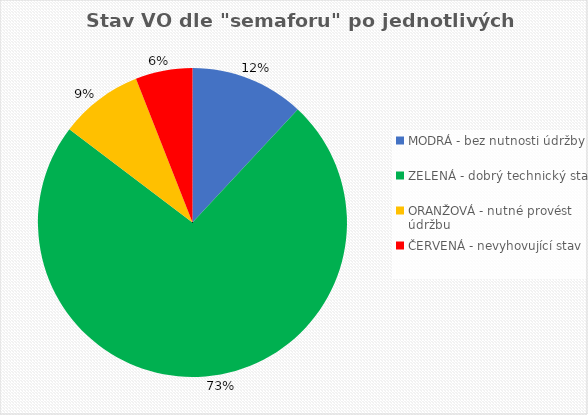
| Category | Stav dle semaforu |
|---|---|
| MODRÁ - bez nutnosti údržby | 26 |
| ZELENÁ - dobrý technický stav | 160 |
| ORANŽOVÁ - nutné provést údržbu | 19 |
| ČERVENÁ - nevyhovující stav | 13 |